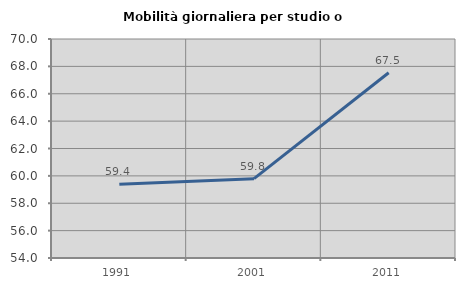
| Category | Mobilità giornaliera per studio o lavoro |
|---|---|
| 1991.0 | 59.387 |
| 2001.0 | 59.798 |
| 2011.0 | 67.534 |